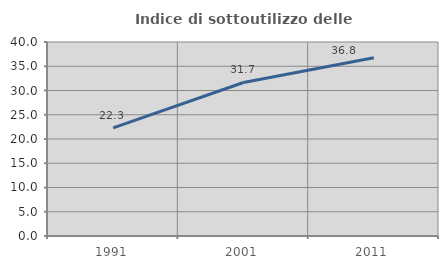
| Category | Indice di sottoutilizzo delle abitazioni  |
|---|---|
| 1991.0 | 22.297 |
| 2001.0 | 31.651 |
| 2011.0 | 36.758 |